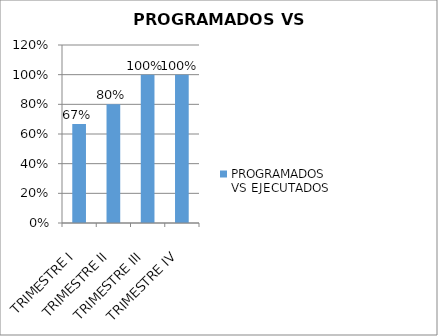
| Category | PROGRAMADOS VS EJECUTADOS |
|---|---|
| TRIMESTRE I | 0.667 |
| TRIMESTRE II | 0.8 |
| TRIMESTRE III | 1 |
| TRIMESTRE IV | 1 |